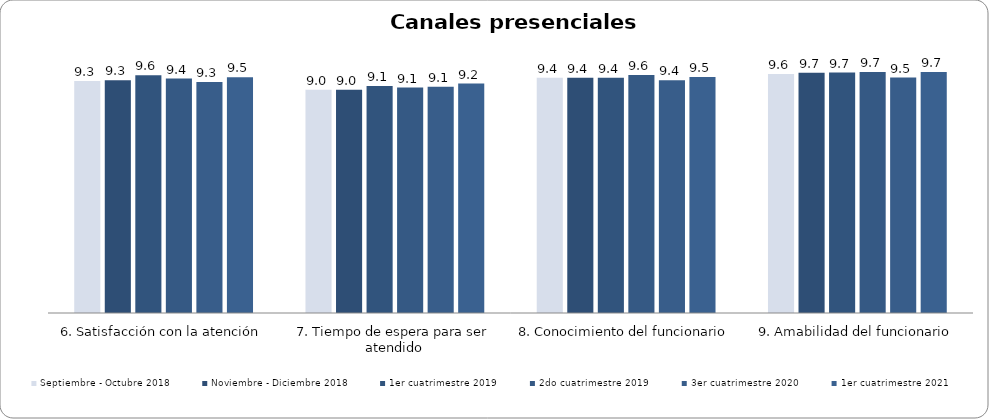
| Category | Septiembre - Octubre 2018 | Noviembre - Diciembre 2018 | 1er cuatrimestre 2019 | 2do cuatrimestre 2019 | 3er cuatrimestre 2020 | 1er cuatrimestre 2021 |
|---|---|---|---|---|---|---|
| 6. Satisfacción con la atención | 9.316 | 9.347 | 9.552 | 9.413 | 9.273 | 9.466 |
| 7. Tiempo de espera para ser atendido | 8.968 | 8.966 | 9.114 | 9.056 | 9.091 | 9.216 |
| 8. Conocimiento del funcionario | 9.443 | 9.449 | 9.448 | 9.556 | 9.351 | 9.483 |
| 9. Amabilidad del funcionario | 9.595 | 9.653 | 9.657 | 9.675 | 9.455 | 9.681 |